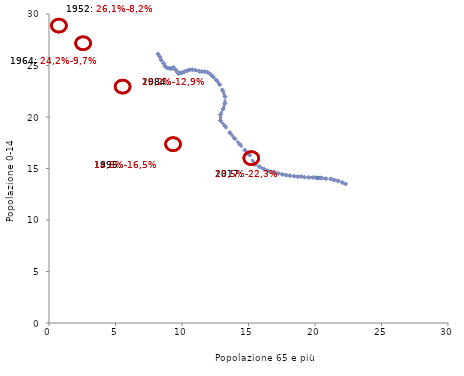
| Category | Series 0 |
|---|---|
| 8.198905129257707 | 26.113 |
| 8.336250307085201 | 25.845 |
| 8.444005048025376 | 25.516 |
| 8.621492993862665 | 25.206 |
| 8.746750236013403 | 24.886 |
| 8.829929488212109 | 24.815 |
| 8.961158434332368 | 24.755 |
| 9.102836031699452 | 24.704 |
| 9.256365732932217 | 24.722 |
| 9.361665566955086 | 24.814 |
| 9.550834115452483 | 24.532 |
| 9.660056126825976 | 24.354 |
| 9.749219347147385 | 24.222 |
| 9.888621507899064 | 24.282 |
| 10.04609188440657 | 24.312 |
| 10.215651270105827 | 24.421 |
| 10.416272653366681 | 24.506 |
| 10.561492964232839 | 24.575 |
| 10.768900610407526 | 24.596 |
| 11.0170813948519 | 24.548 |
| 11.302008860575583 | 24.434 |
| 11.497803418181196 | 24.418 |
| 11.719918731009473 | 24.407 |
| 11.933698124299053 | 24.34 |
| 12.156801045732708 | 24.133 |
| 12.346254454514776 | 23.896 |
| 12.588777154610803 | 23.577 |
| 12.835292225363704 | 23.146 |
| 13.063026348644263 | 22.567 |
| 13.232359439394461 | 21.981 |
| 13.225728072206556 | 21.326 |
| 13.089450598925648 | 20.78 |
| 12.88994770398866 | 20.239 |
| 12.889103491482048 | 19.648 |
| 13.24282561186143 | 19.099 |
| 13.595002636917622 | 18.49 |
| 13.968513165884627 | 17.901 |
| 14.341226101317828 | 17.356 |
| 14.716952444652343 | 16.794 |
| 15.078207487898437 | 16.309 |
| 15.464680231454702 | 15.41 |
| 15.820262665816045 | 15.175 |
| 16.154401102613697 | 14.945 |
| 16.481169088787063 | 14.768 |
| 16.892412078580335 | 14.621 |
| 17.230197767213106 | 14.519 |
| 17.526983292445735 | 14.43 |
| 17.817766220869842 | 14.358 |
| 18.112381798428363 | 14.308 |
| 18.429365289312145 | 14.258 |
| 18.709228673575772 | 14.207 |
| 18.986651369760317 | 14.22 |
| 19.209620164220407 | 14.155 |
| 19.522718308620686 | 14.132 |
| 19.854401197956456 | 14.124 |
| 20.09199030553583 | 14.115 |
| 20.191777470413854 | 14.078 |
| 20.295611979175934 | 14.087 |
| 20.415201564895696 | 14.095 |
| 20.502578216107924 | 14.069 |
| 20.828330951535392 | 14.017 |
| 21.177483332684652 | 13.987 |
| 21.412258507639052 | 13.899 |
| 21.743467275236902 | 13.789 |
| 22.03846133368178 | 13.652 |
| 22.3 | 13.5 |